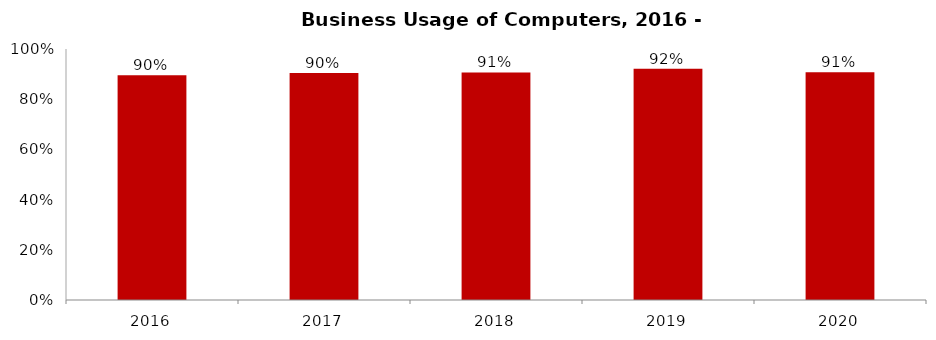
| Category | Business Usage of Computers |
|---|---|
| 2016.0 | 0.896 |
| 2017.0 | 0.904 |
| 2018.0 | 0.906 |
| 2019.0 | 0.922 |
| 2020.0 | 0.907 |